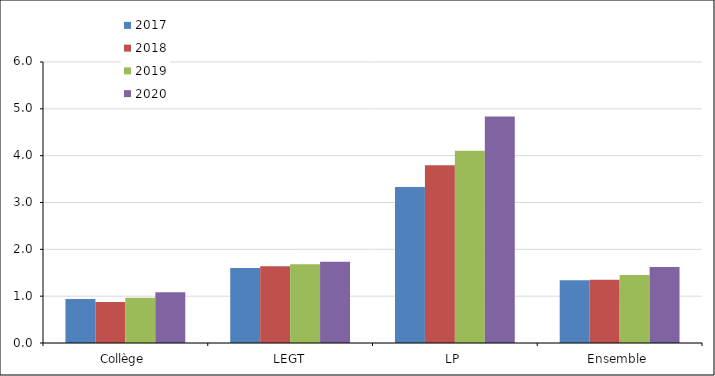
| Category | 2017 | 2018 | 2019 | 2020 |
|---|---|---|---|---|
| Collège | 0.938 | 0.875 | 0.966 | 1.086 |
| LEGT | 1.604 | 1.641 | 1.679 | 1.735 |
| LP | 3.33 | 3.795 | 4.105 | 4.839 |
| Ensemble | 1.342 | 1.353 | 1.451 | 1.622 |